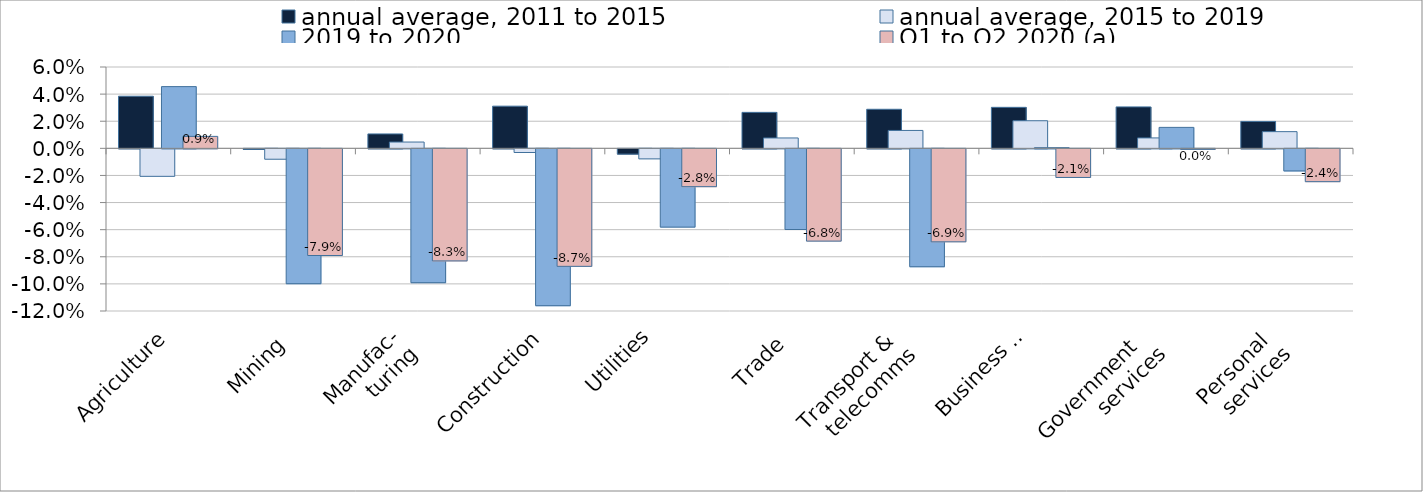
| Category | annual average, 2011 to 2015 | annual average, 2015 to 2019 | 2019 to 2020 | Q1 to Q2 2020 (a) |
|---|---|---|---|---|
| Agriculture | 0.038 | -0.02 | 0.046 | 0.009 |
| Mining | 0 | -0.008 | -0.099 | -0.079 |
| Manufac-
turing | 0.011 | 0.005 | -0.099 | -0.083 |
| Construction | 0.031 | -0.003 | -0.116 | -0.087 |
| Utilities
 | -0.004 | -0.007 | -0.058 | -0.028 |
| Trade | 0.027 | 0.008 | -0.06 | -0.068 |
| Transport & 
telecomms | 0.029 | 0.013 | -0.087 | -0.069 |
| Business 
services | 0.03 | 0.02 | 0 | -0.021 |
| Government  
services | 0.031 | 0.008 | 0.015 | 0 |
| Personal 
services | 0.02 | 0.012 | -0.016 | -0.024 |